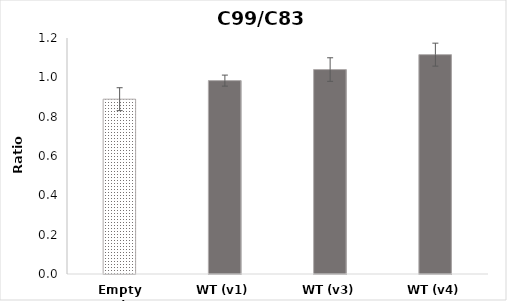
| Category | Series 0 |
|---|---|
| Empty vector | 0.889 |
| WT (v1) | 0.983 |
| WT (v3) | 1.04 |
| WT (v4) | 1.115 |